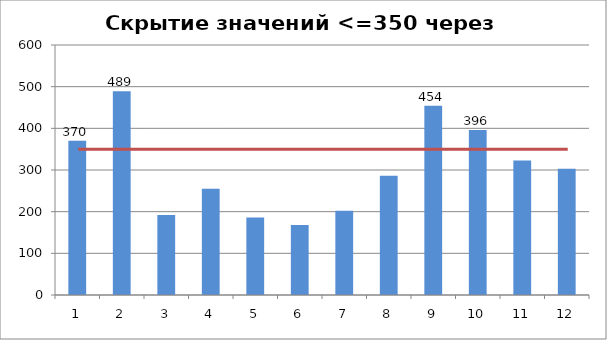
| Category | Динамика продаж |
|---|---|
| 0 | 370 |
| 1 | 489 |
| 2 | 192 |
| 3 | 255 |
| 4 | 186 |
| 5 | 168 |
| 6 | 202 |
| 7 | 286 |
| 8 | 454 |
| 9 | 396 |
| 10 | 323 |
| 11 | 303 |